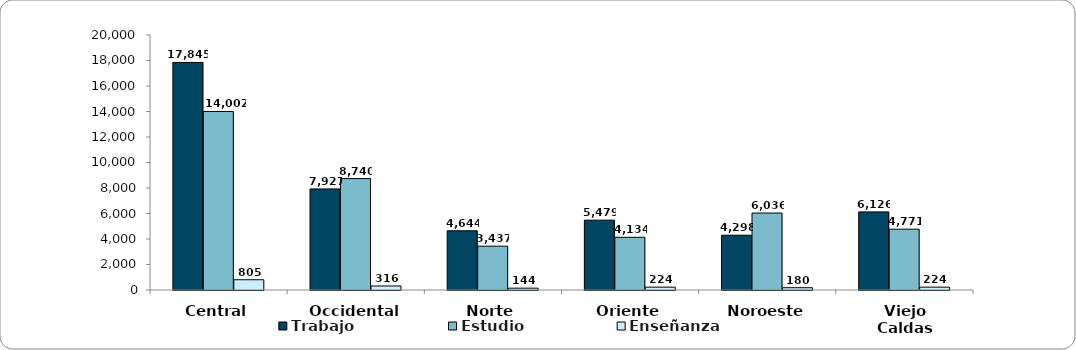
| Category | Trabajo | Estudio | Enseñanza |
|---|---|---|---|
| Central | 17845 | 14002 | 805 |
| Occidental | 7927 | 8740 | 316 |
| Norte | 4644 | 3437 | 144 |
| Oriente | 5479 | 4134 | 224 |
| Noroeste | 4298 | 6036 | 180 |
| Viejo Caldas | 6126 | 4771 | 224 |